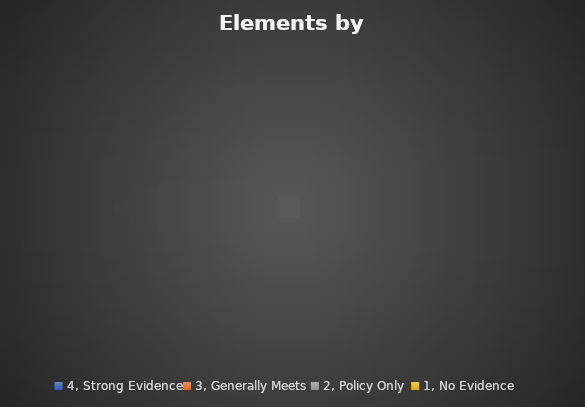
| Category | Series 0 | Series 1 | Series 2 |
|---|---|---|---|
| 4, Strong Evidence |  | 0 |  |
| 3, Generally Meets |  | 0 |  |
| 2, Policy Only  |  | 0 |  |
| 1, No Evidence  |  | 0 |  |